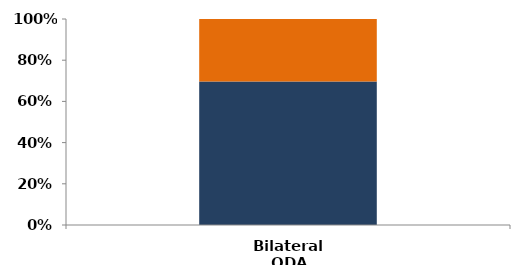
| Category | Country/ region specific | Country/ region unspecific |
|---|---|---|
| Bilateral ODA | 4442.434 | 1930.104 |